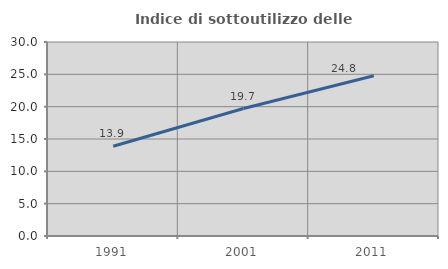
| Category | Indice di sottoutilizzo delle abitazioni  |
|---|---|
| 1991.0 | 13.883 |
| 2001.0 | 19.71 |
| 2011.0 | 24.788 |